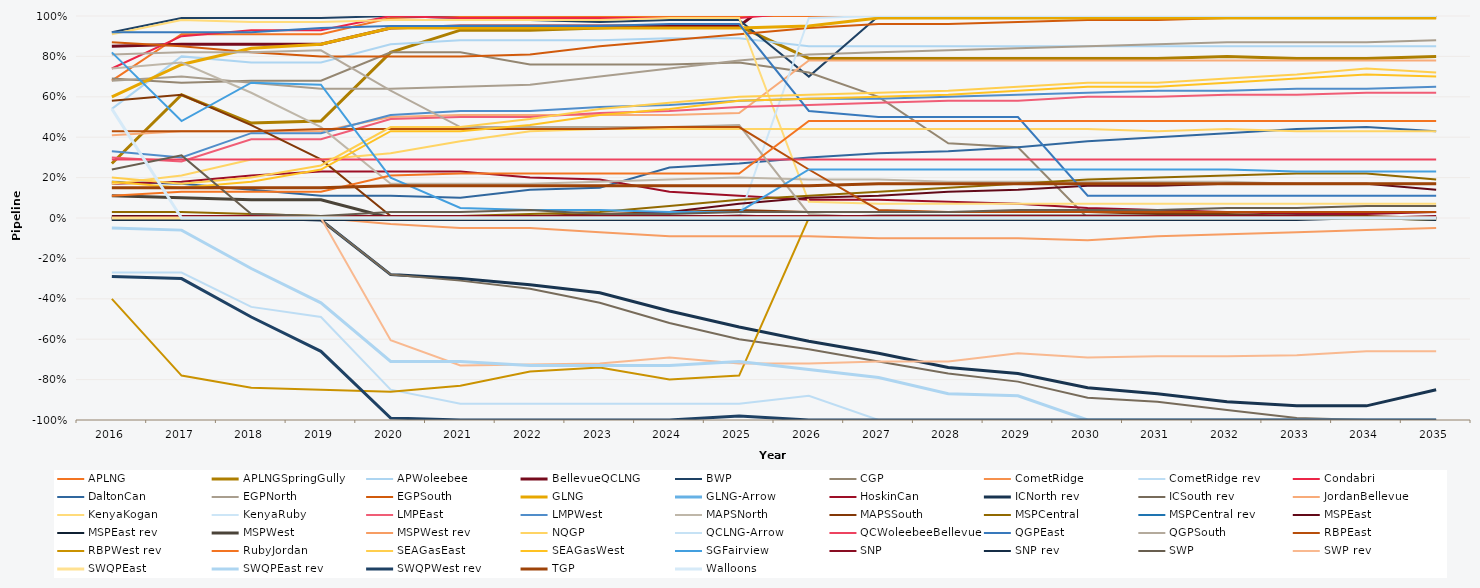
| Category | APLNG | APLNGSpringGully | APWoleebee | BellevueQCLNG | BWP | CGP | CometRidge | CometRidge rev | Condabri | DaltonCan | EGPNorth | EGPSouth | GLNG | GLNG-Arrow | HoskinCan | ICNorth rev | ICSouth rev | JordanBellevue | KenyaKogan | KenyaRuby | LMPEast | LMPWest | MAPSNorth | MAPSSouth | MSPCentral | MSPCentral rev | MSPEast | MSPEast rev | MSPWest | MSPWest rev | NQGP | QCLNG-Arrow | QCWoleebeeBellevue | QGPEast | QGPSouth | RBPEast | RBPWest rev | RubyJordan | SEAGasEast | SEAGasWest | SGFairview | SNP | SNP rev | SWP | SWP rev | SWQPEast | SWQPEast rev | SWQPWest rev | TGP | Walloons |
|---|---|---|---|---|---|---|---|---|---|---|---|---|---|---|---|---|---|---|---|---|---|---|---|---|---|---|---|---|---|---|---|---|---|---|---|---|---|---|---|---|---|---|---|---|---|---|---|---|---|---|
| 2016.0 | 0.68 | 0.27 | 0.54 | 0.85 | 0.92 | 0.69 | 0 | -0.27 | 0.74 | 0.18 | 0.68 | 0.87 | 0.6 | 0 | 0.17 | 0 | -0.01 | 0.41 | 0.91 | 0 | 0.3 | 0.33 | 0.74 | 0.58 | 0.03 | 0 | 0.01 | 0 | 0.11 | 0 | 0.17 | 0 | 0.29 | 0.92 | 0.81 | 0.43 | -0.4 | 0.11 | 0.2 | 0.18 | 0.82 | 0 | -0.01 | 0.24 | 0 | 0 | -0.05 | -0.29 | 0.15 | 0.54 |
| 2017.0 | 0.91 | 0.61 | 0.8 | 0.86 | 0.99 | 0.67 | 0 | -0.27 | 0.9 | 0.17 | 0.7 | 0.85 | 0.76 | 0 | 0.18 | 0 | -0.01 | 0.43 | 0.98 | 0 | 0.28 | 0.3 | 0.77 | 0.61 | 0.03 | 0 | 0.01 | 0 | 0.1 | 0 | 0.21 | 0 | 0.29 | 0.92 | 0.82 | 0.43 | -0.78 | 0.13 | 0.17 | 0.15 | 0.48 | 0.01 | -0.01 | 0.31 | 0 | 0 | -0.06 | -0.3 | 0.15 | 0 |
| 2018.0 | 0.91 | 0.47 | 0.77 | 0.86 | 0.99 | 0.68 | 0 | -0.44 | 0.93 | 0.14 | 0.67 | 0.82 | 0.84 | 0 | 0.21 | 0 | -0.01 | 0.43 | 0.97 | 0 | 0.39 | 0.42 | 0.62 | 0.46 | 0.02 | 0 | 0 | 0 | 0.09 | 0 | 0.29 | 0 | 0.29 | 0.92 | 0.82 | 0.43 | -0.84 | 0.13 | 0.2 | 0.18 | 0.67 | 0.01 | -0.01 | 0.02 | 0 | 0 | -0.25 | -0.49 | 0.15 | 0 |
| 2019.0 | 0.91 | 0.48 | 0.77 | 0.86 | 0.99 | 0.68 | 0 | -0.49 | 0.93 | 0.11 | 0.64 | 0.8 | 0.86 | 0 | 0.23 | -0.01 | -0.01 | 0.43 | 0.97 | 0 | 0.39 | 0.42 | 0.45 | 0.29 | 0.01 | 0 | 0 | 0 | 0.09 | 0 | 0.29 | 0 | 0.29 | 0.94 | 0.83 | 0.44 | -0.85 | 0.13 | 0.26 | 0.24 | 0.66 | 0.01 | -0.01 | 0.01 | 0 | 0 | -0.42 | -0.66 | 0.15 | 0 |
| 2020.0 | 0.99 | 0.82 | 0.86 | 0.94 | 1 | 0.82 | 0 | -0.85 | 1 | 0.11 | 0.64 | 0.8 | 0.94 | 0 | 0.23 | -0.28 | -0.28 | 0.5 | 0.98 | 0 | 0.49 | 0.51 | 0.17 | 0.01 | 0.01 | 0 | 0 | 0 | 0 | -0.03 | 0.32 | 0 | 0.29 | 0.95 | 0.63 | 0.44 | -0.86 | 0.21 | 0.45 | 0.43 | 0.2 | 0.01 | -0.01 | 0.03 | -0.605 | 0 | -0.71 | -0.99 | 0.16 | 0 |
| 2021.0 | 1 | 0.93 | 0.88 | 0.95 | 0.99 | 0.82 | 0 | -0.92 | 0.99 | 0.1 | 0.65 | 0.8 | 0.94 | 0 | 0.23 | -0.3 | -0.31 | 0.51 | 0.98 | 0 | 0.5 | 0.53 | 0.17 | 0.01 | 0.01 | 0 | 0 | 0 | 0 | -0.05 | 0.38 | 0 | 0.29 | 0.95 | 0.45 | 0.44 | -0.83 | 0.22 | 0.45 | 0.43 | 0.05 | 0.01 | -0.01 | 0.03 | -0.73 | 0 | -0.71 | -1 | 0.16 | 0 |
| 2022.0 | 1 | 0.93 | 0.88 | 0.95 | 0.98 | 0.76 | 0 | -0.92 | 0.99 | 0.14 | 0.66 | 0.81 | 0.94 | 0 | 0.2 | -0.33 | -0.35 | 0.51 | 0.98 | 0 | 0.5 | 0.53 | 0.17 | 0.01 | 0.02 | 0 | 0 | 0 | 0 | -0.05 | 0.43 | 0 | 0.29 | 0.95 | 0.45 | 0.44 | -0.76 | 0.22 | 0.49 | 0.46 | 0.04 | 0.01 | -0.01 | 0.04 | -0.725 | 0 | -0.73 | -1 | 0.16 | 0 |
| 2023.0 | 1 | 0.94 | 0.88 | 0.95 | 0.97 | 0.76 | 0 | -0.92 | 0.99 | 0.15 | 0.7 | 0.85 | 0.94 | 0 | 0.19 | -0.37 | -0.42 | 0.51 | 0.98 | 0 | 0.52 | 0.55 | 0.18 | 0.02 | 0.03 | 0 | 0.01 | 0 | 0 | -0.07 | 0.44 | 0 | 0.29 | 0.95 | 0.45 | 0.44 | -0.74 | 0.22 | 0.54 | 0.51 | 0.04 | 0.01 | -0.01 | 0.02 | -0.72 | 0 | -0.73 | -1 | 0.16 | 0 |
| 2024.0 | 1 | 0.95 | 0.89 | 0.95 | 0.98 | 0.76 | 0 | -0.92 | 0.99 | 0.25 | 0.74 | 0.88 | 0.94 | 0 | 0.13 | -0.46 | -0.52 | 0.51 | 0.99 | 0 | 0.53 | 0.56 | 0.19 | 0.03 | 0.06 | 0 | 0.03 | 0 | 0 | -0.09 | 0.44 | 0 | 0.29 | 0.96 | 0.45 | 0.45 | -0.8 | 0.22 | 0.57 | 0.54 | 0.03 | 0.01 | -0.01 | 0.02 | -0.69 | 0 | -0.73 | -1 | 0.16 | 0 |
| 2025.0 | 1 | 0.95 | 0.89 | 0.95 | 0.98 | 0.77 | 0 | -0.92 | 0.99 | 0.27 | 0.78 | 0.91 | 0.94 | 0 | 0.11 | -0.54 | -0.6 | 0.52 | 0.99 | 0 | 0.55 | 0.58 | 0.2 | 0.04 | 0.09 | 0 | 0.07 | -0.01 | 0.01 | -0.09 | 0.44 | 0 | 0.29 | 0.96 | 0.46 | 0.45 | -0.78 | 0.22 | 0.6 | 0.58 | 0.03 | 0.01 | -0.01 | 0.03 | -0.72 | 0 | -0.71 | -0.98 | 0.16 | 0 |
| 2026.0 | 1 | 0.79 | 0.85 | 1.21 | 0.7 | 0.72 | 0 | -0.88 | 1.02 | 0.3 | 0.81 | 0.94 | 0.95 | 0 | 0.09 | -0.61 | -0.65 | 0.78 | 0.08 | 0.99 | 0.56 | 0.59 | 0.19 | 0.03 | 0.11 | 0 | 0.1 | -0.01 | 0 | -0.09 | 0.44 | 0 | 0.29 | 0.53 | 0.02 | 0.24 | 0 | 0.48 | 0.61 | 0.59 | 0.24 | 0.01 | -0.01 | 0.03 | -0.72 | 0 | -0.75 | -1 | 0.16 | 0 |
| 2027.0 | 1 | 0.79 | 0.85 | 1.22 | 1 | 0.6 | 0 | -1 | 1.02 | 0.32 | 0.82 | 0.96 | 0.99 | 0 | 0.09 | -0.67 | -0.71 | 0.78 | 0.07 | 1 | 0.57 | 0.59 | 0.19 | 0.03 | 0.13 | 0 | 0.11 | -0.01 | 0.01 | -0.1 | 0.44 | 0 | 0.29 | 0.5 | 0 | 0.04 | 0 | 0.48 | 0.62 | 0.6 | 0.24 | 0.01 | -0.01 | 0.03 | -0.71 | 0 | -0.79 | -1 | 0.17 | 0 |
| 2028.0 | 1 | 0.79 | 0.85 | 1.22 | 1 | 0.37 | 0 | -1 | 1.03 | 0.33 | 0.83 | 0.96 | 0.99 | 0 | 0.08 | -0.74 | -0.77 | 0.78 | 0.07 | 1 | 0.58 | 0.6 | 0.18 | 0.03 | 0.15 | 0 | 0.13 | -0.01 | 0.01 | -0.1 | 0.44 | 0 | 0.29 | 0.5 | 0 | 0.03 | 0 | 0.48 | 0.63 | 0.61 | 0.24 | 0.01 | -0.01 | 0.03 | -0.71 | 0 | -0.87 | -1 | 0.17 | 0 |
| 2029.0 | 1 | 0.79 | 0.85 | 1.22 | 1 | 0.35 | 0 | -1 | 1.02 | 0.35 | 0.84 | 0.97 | 0.99 | 0 | 0.07 | -0.77 | -0.81 | 0.78 | 0.07 | 1 | 0.58 | 0.61 | 0.18 | 0.03 | 0.17 | 0 | 0.14 | -0.01 | 0.01 | -0.1 | 0.44 | 0 | 0.29 | 0.5 | 0 | 0.03 | 0 | 0.48 | 0.65 | 0.63 | 0.24 | 0.01 | -0.01 | 0.04 | -0.67 | 0 | -0.88 | -1 | 0.17 | 0 |
| 2030.0 | 1 | 0.79 | 0.85 | 1.22 | 1 | 0 | 0 | -1 | 1.02 | 0.38 | 0.85 | 0.98 | 0.99 | 0 | 0.05 | -0.84 | -0.89 | 0.78 | 0.07 | 1 | 0.6 | 0.62 | 0.18 | 0.03 | 0.19 | 0 | 0.16 | -0.01 | 0.01 | -0.11 | 0.44 | 0 | 0.29 | 0.11 | 0 | 0.03 | 0 | 0.48 | 0.67 | 0.65 | 0.24 | 0.01 | -0.01 | 0.04 | -0.69 | 0 | -1 | -1 | 0.17 | 0 |
| 2031.0 | 1 | 0.79 | 0.85 | 1.22 | 1 | 0 | 0 | -1 | 1.02 | 0.4 | 0.86 | 0.98 | 0.99 | 0 | 0.04 | -0.87 | -0.91 | 0.78 | 0.07 | 1 | 0.6 | 0.63 | 0.18 | 0.02 | 0.2 | 0 | 0.16 | -0.01 | 0.01 | -0.09 | 0.43 | 0 | 0.29 | 0.11 | 0 | 0.03 | 0 | 0.48 | 0.67 | 0.65 | 0.24 | 0.01 | -0.01 | 0.04 | -0.685 | 0 | -1 | -1 | 0.17 | 0 |
| 2032.0 | 1 | 0.8 | 0.85 | 1.22 | 1 | 0 | 0 | -1 | 1.03 | 0.42 | 0.87 | 0.99 | 0.99 | 0 | 0.03 | -0.91 | -0.95 | 0.78 | 0.07 | 1 | 0.61 | 0.63 | 0.18 | 0.02 | 0.21 | 0 | 0.17 | -0.01 | 0.01 | -0.08 | 0.44 | 0 | 0.29 | 0.11 | 0 | 0.03 | 0 | 0.48 | 0.69 | 0.67 | 0.24 | 0.01 | -0.01 | 0.05 | -0.685 | 0 | -1 | -1 | 0.17 | 0 |
| 2033.0 | 1 | 0.79 | 0.85 | 1.22 | 1 | 0 | 0 | -1 | 1.02 | 0.44 | 0.87 | 0.99 | 0.99 | 0 | 0.02 | -0.93 | -0.99 | 0.78 | 0.07 | 1 | 0.61 | 0.64 | 0.17 | 0.01 | 0.22 | 0 | 0.17 | 0 | 0.01 | -0.07 | 0.43 | 0 | 0.29 | 0.11 | 0 | 0.03 | 0 | 0.48 | 0.71 | 0.69 | 0.23 | 0.01 | -0.01 | 0.05 | -0.68 | 0 | -1 | -1 | 0.17 | 0 |
| 2034.0 | 1 | 0.79 | 0.85 | 1.22 | 1 | 0 | 0 | -1 | 1.02 | 0.45 | 0.87 | 0.99 | 0.99 | 0 | 0.02 | -0.93 | -1 | 0.78 | 0.07 | 1 | 0.62 | 0.64 | 0.17 | 0.01 | 0.22 | 0 | 0.17 | 0 | 0 | -0.06 | 0.43 | 0 | 0.29 | 0.11 | 0 | 0.03 | 0 | 0.48 | 0.74 | 0.71 | 0.23 | 0 | 0 | 0.06 | -0.66 | 0 | -1 | -1 | 0.17 | 0 |
| 2035.0 | 1 | 0.8 | 0.85 | 1.22 | 1 | 0 | 0 | -1 | 1.02 | 0.43 | 0.88 | 0.99 | 0.99 | 0 | 0.03 | -0.85 | -1 | 0.78 | 0.07 | 1 | 0.62 | 0.65 | 0.17 | 0 | 0.19 | 0 | 0.14 | 0 | 0 | -0.05 | 0.43 | 0 | 0.29 | 0.11 | 0 | 0.03 | -0.01 | 0.48 | 0.72 | 0.7 | 0.23 | 0.01 | -0.01 | 0.06 | -0.66 | 0 | -1 | -1 | 0.17 | 0 |